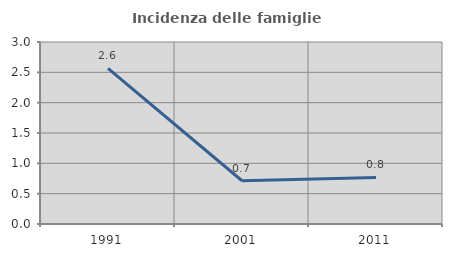
| Category | Incidenza delle famiglie numerose |
|---|---|
| 1991.0 | 2.564 |
| 2001.0 | 0.713 |
| 2011.0 | 0.768 |